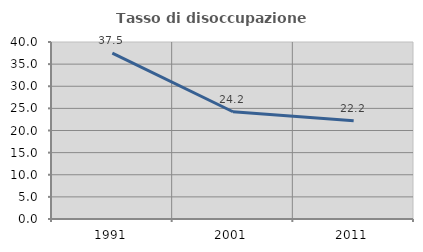
| Category | Tasso di disoccupazione giovanile  |
|---|---|
| 1991.0 | 37.5 |
| 2001.0 | 24.242 |
| 2011.0 | 22.222 |